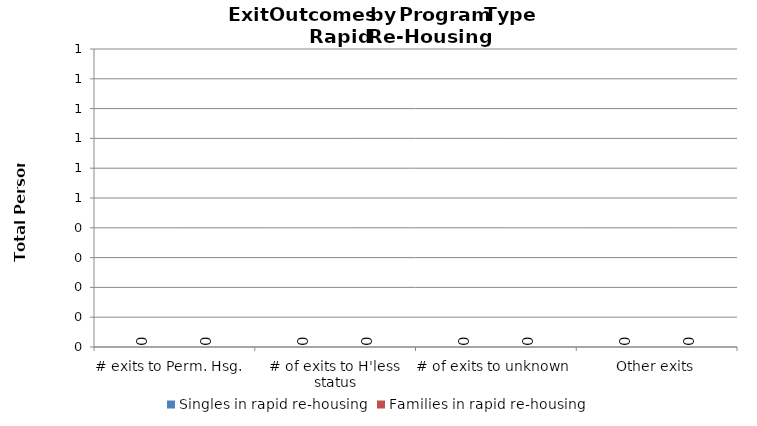
| Category | Singles in rapid re-housing | Families in rapid re-housing |
|---|---|---|
| # exits to Perm. Hsg.   | 0 | 0 |
| # of exits to H'less status | 0 | 0 |
| # of exits to unknown | 0 | 0 |
| Other exits | 0 | 0 |